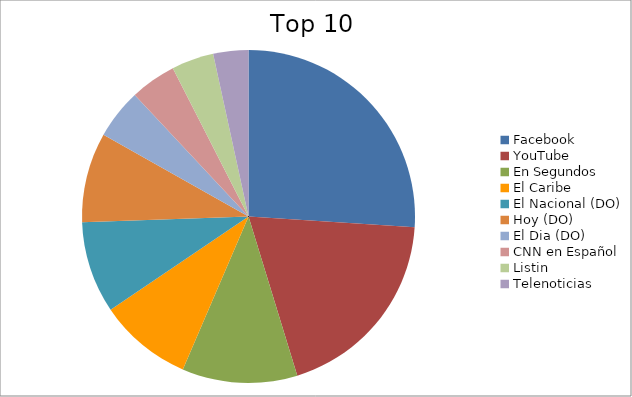
| Category | Series 0 |
|---|---|
| Facebook | 17.4 |
| YouTube | 12.86 |
| En Segundos | 7.48 |
| El Caribe | 6.07 |
| El Nacional (DO) | 5.96 |
| Hoy (DO) | 5.83 |
| El Dia (DO) | 3.25 |
| CNN en Español | 2.98 |
| Listin | 2.74 |
| Telenoticias | 2.28 |